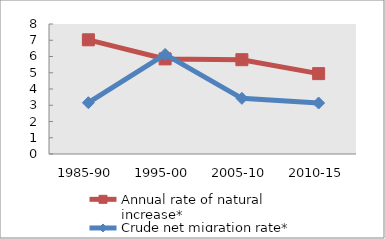
| Category | Annual rate of natural increase* | Crude net migration rate* |
|---|---|---|
| 1985-90 | 7.027 | 3.156 |
| 1995-00 | 5.852 | 6.13 |
| 2005-10 | 5.803 | 3.424 |
| 2010-15 | 4.946 | 3.138 |